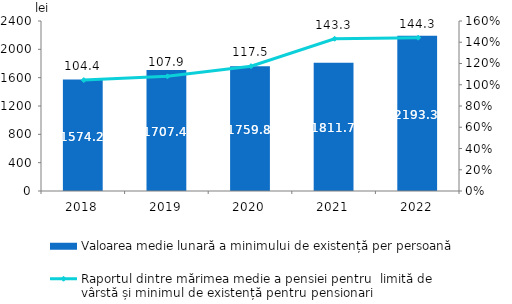
| Category | Valoarea medie lunară a minimului de existență per persoană |
|---|---|
| 2018.0 | 1574.2 |
| 2019.0 | 1707.4 |
| 2020.0 | 1759.8 |
| 2021.0 | 1811.7 |
| 2022.0 | 2193.3 |